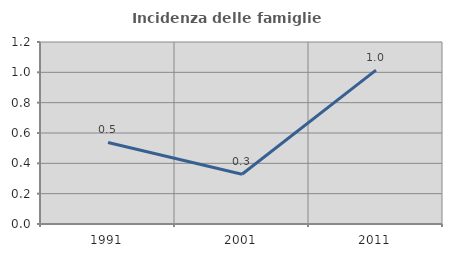
| Category | Incidenza delle famiglie numerose |
|---|---|
| 1991.0 | 0.538 |
| 2001.0 | 0.328 |
| 2011.0 | 1.015 |